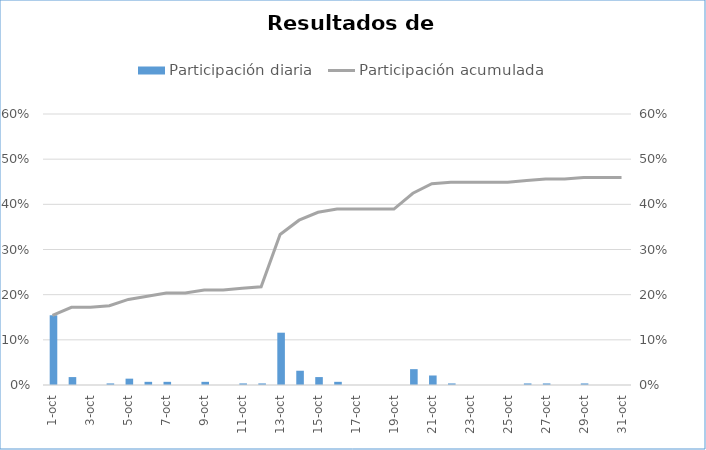
| Category | Participación diaria |
|---|---|
| 2020-10-01 | 0.154 |
| 2020-10-02 | 0.018 |
| 2020-10-03 | 0 |
| 2020-10-04 | 0.004 |
| 2020-10-05 | 0.014 |
| 2020-10-06 | 0.007 |
| 2020-10-07 | 0.007 |
| 2020-10-08 | 0 |
| 2020-10-09 | 0.007 |
| 2020-10-10 | 0 |
| 2020-10-11 | 0.004 |
| 2020-10-12 | 0.004 |
| 2020-10-13 | 0.116 |
| 2020-10-14 | 0.032 |
| 2020-10-15 | 0.018 |
| 2020-10-16 | 0.007 |
| 2020-10-17 | 0 |
| 2020-10-18 | 0 |
| 2020-10-19 | 0 |
| 2020-10-20 | 0.035 |
| 2020-10-21 | 0.021 |
| 2020-10-22 | 0.004 |
| 2020-10-23 | 0 |
| 2020-10-24 | 0 |
| 2020-10-25 | 0 |
| 2020-10-26 | 0.004 |
| 2020-10-27 | 0.004 |
| 2020-10-28 | 0 |
| 2020-10-29 | 0.004 |
| 2020-10-30 | 0 |
| 2020-10-31 | 0 |